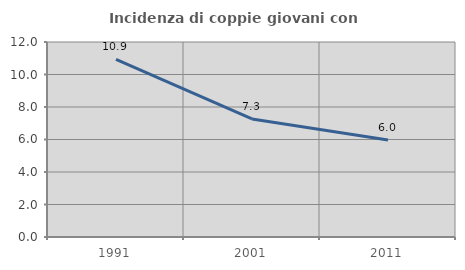
| Category | Incidenza di coppie giovani con figli |
|---|---|
| 1991.0 | 10.929 |
| 2001.0 | 7.263 |
| 2011.0 | 5.97 |